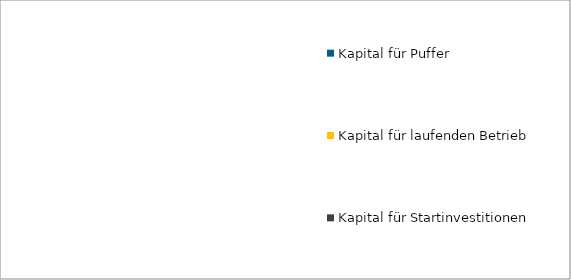
| Category | Kapital für Startinvestitionen | Kapital für laufenden Betrieb | Kapital für Puffer |
|---|---|---|---|
| 0 | 0 | 0 | 0 |